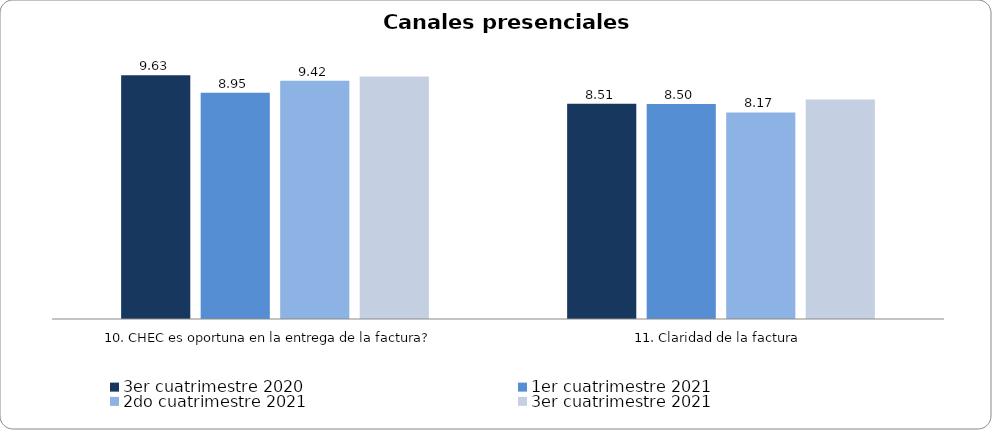
| Category | 3er cuatrimestre 2020 | Septiembre - Octubre 2018 | 1er cuatrimestre 2021 | Noviembre - Diciembre 2018 | 1er cuatrimestre 2019 | 2do cuatrimestre 2019 | 2do cuatrimestre 2021 | 3er cuatrimestre 2021 |
|---|---|---|---|---|---|---|---|---|
| 10. CHEC es oportuna en la entrega de la factura? | 9.632 |  | 8.947 |  |  |  | 9.421 | 9.588 |
| 11. Claridad de la factura | 8.508 |  | 8.496 |  |  |  | 8.165 | 8.68 |